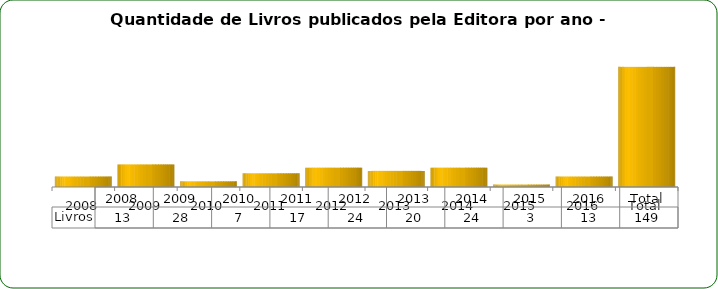
| Category | Livros |
|---|---|
| 2008 | 13 |
| 2009 | 28 |
| 2010 | 7 |
| 2011 | 17 |
| 2012 | 24 |
| 2013 | 20 |
| 2014 | 24 |
| 2015 | 3 |
| 2016 | 13 |
| Total | 149 |